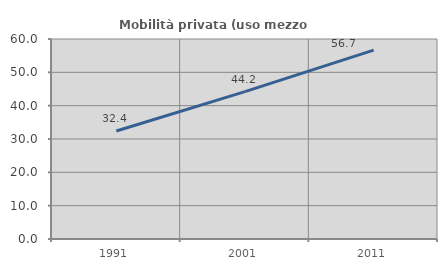
| Category | Mobilità privata (uso mezzo privato) |
|---|---|
| 1991.0 | 32.415 |
| 2001.0 | 44.218 |
| 2011.0 | 56.657 |